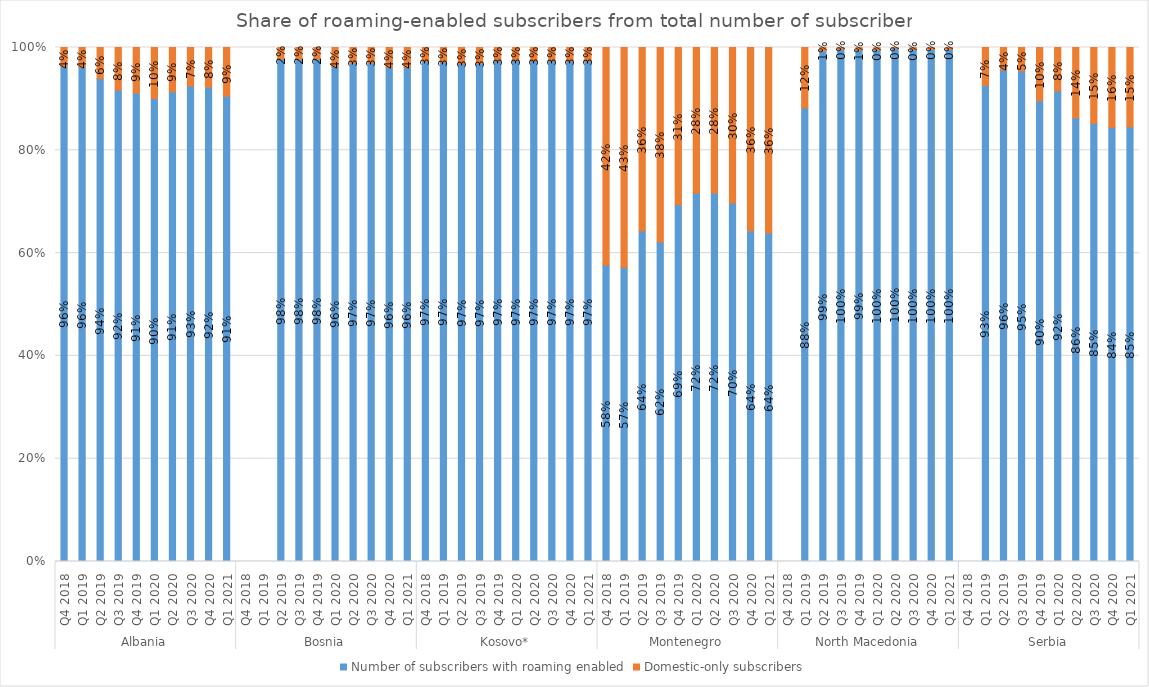
| Category | Number of subscribers with roaming enabled | Domestic-only subscribers |
|---|---|---|
| 0 | 0.964 | 0.036 |
| 1 | 0.961 | 0.039 |
| 2 | 0.939 | 0.061 |
| 3 | 0.917 | 0.083 |
| 4 | 0.911 | 0.089 |
| 5 | 0.901 | 0.099 |
| 6 | 0.914 | 0.086 |
| 7 | 0.925 | 0.075 |
| 8 | 0.923 | 0.077 |
| 9 | 0.905 | 0.095 |
| 10 | 0 | 0 |
| 11 | 0 | 0 |
| 12 | 0.978 | 0.022 |
| 13 | 0.977 | 0.023 |
| 14 | 0.978 | 0.022 |
| 15 | 0.963 | 0.037 |
| 16 | 0.97 | 0.03 |
| 17 | 0.97 | 0.03 |
| 18 | 0.961 | 0.039 |
| 19 | 0.961 | 0.039 |
| 20 | 0.973 | 0.027 |
| 21 | 0.972 | 0.028 |
| 22 | 0.969 | 0.031 |
| 23 | 0.969 | 0.031 |
| 24 | 0.974 | 0.026 |
| 25 | 0.975 | 0.025 |
| 26 | 0.974 | 0.026 |
| 27 | 0.974 | 0.026 |
| 28 | 0.973 | 0.027 |
| 29 | 0.974 | 0.026 |
| 30 | 0.576 | 0.424 |
| 31 | 0.572 | 0.428 |
| 32 | 0.643 | 0.357 |
| 33 | 0.622 | 0.378 |
| 34 | 0.694 | 0.306 |
| 35 | 0.717 | 0.283 |
| 36 | 0.717 | 0.283 |
| 37 | 0.697 | 0.303 |
| 38 | 0.643 | 0.357 |
| 39 | 0.639 | 0.361 |
| 40 | 0 | 0 |
| 41 | 0.882 | 0.118 |
| 42 | 0.993 | 0.007 |
| 43 | 0.997 | 0.003 |
| 44 | 0.995 | 0.005 |
| 45 | 0.996 | 0.004 |
| 46 | 0.998 | 0.002 |
| 47 | 0.996 | 0.004 |
| 48 | 0.996 | 0.004 |
| 49 | 0.996 | 0.004 |
| 50 | 0 | 0 |
| 51 | 0.926 | 0.074 |
| 52 | 0.956 | 0.044 |
| 53 | 0.954 | 0.046 |
| 54 | 0.897 | 0.103 |
| 55 | 0.916 | 0.084 |
| 56 | 0.863 | 0.137 |
| 57 | 0.853 | 0.147 |
| 58 | 0.845 | 0.155 |
| 59 | 0.845 | 0.155 |